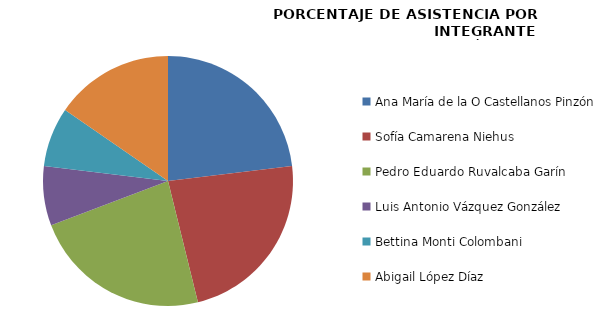
| Category | Series 0 |
|---|---|
| Ana María de la O Castellanos Pinzón | 100 |
| Sofía Camarena Niehus | 100 |
| Pedro Eduardo Ruvalcaba Garín | 100 |
| Luis Antonio Vázquez González | 33.333 |
| Bettina Monti Colombani | 33.333 |
| Abigail López Díaz | 66.667 |